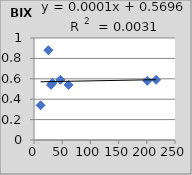
| Category | BIX |
|---|---|
| 25.5 | 0.88 |
| 61.3 | 0.54 |
| 11.7 | 0.34 |
| 216.5 | 0.59 |
| 46.8 | 0.59 |
| 32.5 | 0.56 |
| 200.8 | 0.58 |
| 30.1 | 0.54 |